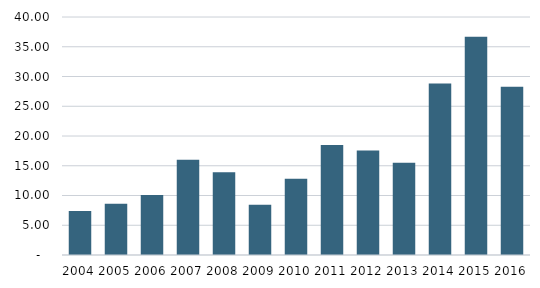
| Category | Deal value ($B) |
|---|---|
| 2004.0 | 7.415 |
| 2005.0 | 8.623 |
| 2006.0 | 10.103 |
| 2007.0 | 16.015 |
| 2008.0 | 13.907 |
| 2009.0 | 8.446 |
| 2010.0 | 12.807 |
| 2011.0 | 18.471 |
| 2012.0 | 17.559 |
| 2013.0 | 15.5 |
| 2014.0 | 28.805 |
| 2015.0 | 36.684 |
| 2016.0 | 28.258 |